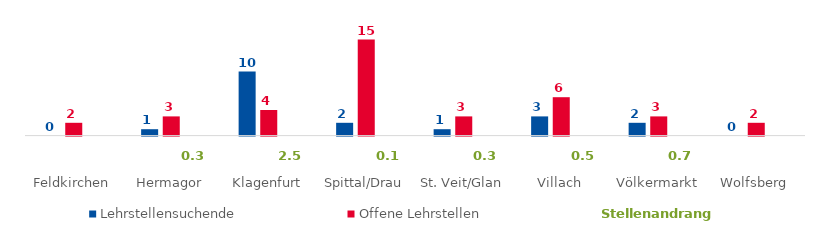
| Category | Lehrstellensuchende | Offene Lehrstellen | Stellenandrang |
|---|---|---|---|
| Feldkirchen | 0 | 2 | -1 |
| Hermagor | 1 | 3 | -1 |
| Klagenfurt | 10 | 4 | -1 |
| Spittal/Drau | 2 | 15 | -1 |
| St. Veit/Glan | 1 | 3 | -1 |
| Villach | 3 | 6 | -1 |
| Völkermarkt | 2 | 3 | -1 |
| Wolfsberg | 0 | 2 | -1 |